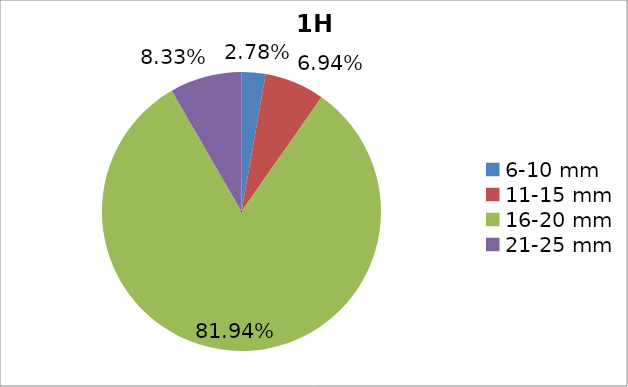
| Category | Series 0 |
|---|---|
| 6-10 mm | 0.028 |
| 11-15 mm | 0.069 |
| 16-20 mm | 0.819 |
| 21-25 mm | 0.083 |